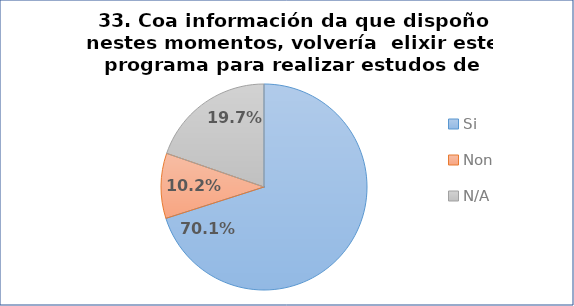
| Category | Pregunta 33. Coa información da que dispoño nestes momentos, volvería  elixir este programa para realizar estudos de doutoramento |
|---|---|
| Si | 0.701 |
| Non | 0.102 |
| N/A | 0.197 |